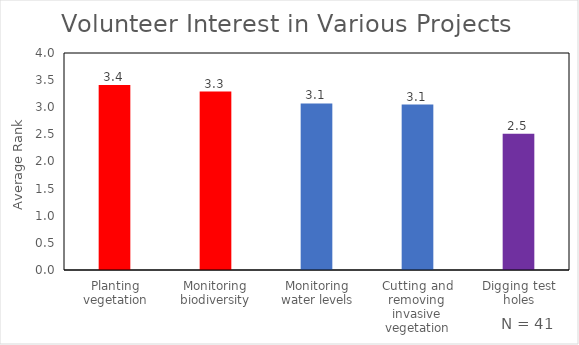
| Category | Average Rank |
|---|---|
| Planting vegetation | 3.41 |
| Monitoring biodiversity | 3.29 |
| Monitoring water levels | 3.07 |
| Cutting and removing invasive vegetation | 3.05 |
| Digging test holes | 2.51 |